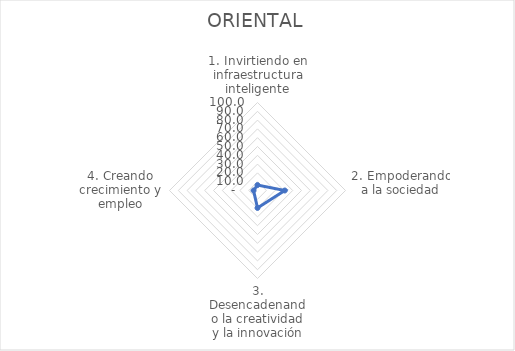
| Category | ORIENTAL |
|---|---|
| 1. Invirtiendo en infraestructura inteligente | 6.164 |
| 2. Empoderando a la sociedad | 30.995 |
| 3. Desencadenando la creatividad y la innovación | 19.822 |
| 4. Creando crecimiento y empleo | 4.499 |